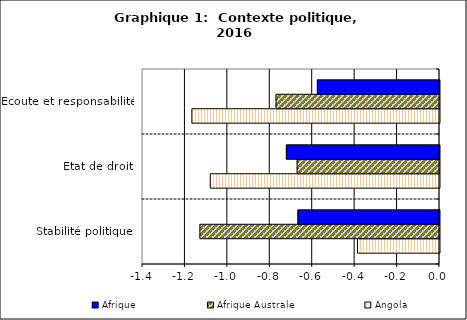
| Category | Angola | Afrique Australe | Afrique |
|---|---|---|---|
| Stabilité politique | -0.387 | -1.129 | -0.667 |
| Etat de droit | -1.081 | -0.671 | -0.722 |
| Ecoute et responsabilité | -1.167 | -0.771 | -0.576 |